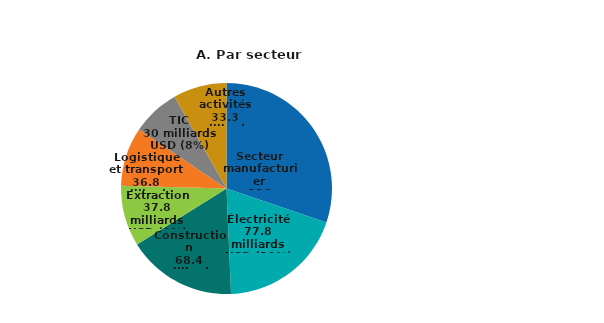
| Category | Total 2017-22  |
|---|---|
| Secteur manufacturier | 123.029 |
| Électricité | 77.775 |
| Construction | 68.41 |
| Extraction | 37.817 |
| Logistique/transports | 36.814 |
| TIC | 30.041 |
| Autres activités | 33.329 |